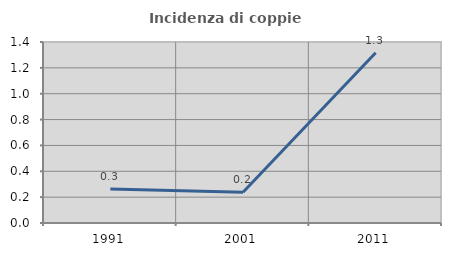
| Category | Incidenza di coppie miste |
|---|---|
| 1991.0 | 0.264 |
| 2001.0 | 0.238 |
| 2011.0 | 1.317 |